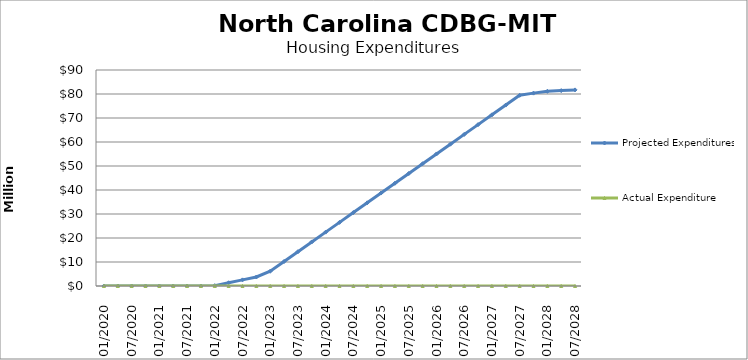
| Category | Projected Expenditures | Actual Expenditure |
|---|---|---|
| 01/2020 | 0 | 0 |
| 04/2020 | 0 | 0 |
| 07/2020 | 0 | 0 |
| 10/2020 | 0 | 0 |
| 01/2021 | 0 | 0 |
| 04/2021 | 0 | 0 |
| 07/2021 | 0 | 0 |
| 10/2021 | 0 | 0 |
| 01/2022 | 150000 | 0 |
| 04/2022 | 1350000 | 0 |
| 07/2022 | 2550000 | 0 |
| 10/2022 | 3750000 | 0 |
| 01/2023 | 6150000 | 0 |
| 04/2023 | 10222864.475 | 0 |
| 07/2023 | 14295728.95 | 0 |
| 10/2023 | 18368593.425 | 0 |
| 01/2024 | 22441457.9 | 0 |
| 04/2024 | 26514322.375 | 0 |
| 07/2024 | 30587186.85 | 0 |
| 10/2024 | 34660051.324 | 0 |
| 01/2025 | 38732915.799 | 0 |
| 04/2025 | 42805780.274 | 0 |
| 07/2025 | 46878644.749 | 0 |
| 10/2025 | 50951509.224 | 0 |
| 01/2026 | 55024373.699 | 0 |
| 04/2026 | 59097238.174 | 0 |
| 07/2026 | 63170102.649 | 0 |
| 10/2026 | 67242967.124 | 0 |
| 01/2027 | 71315831.599 | 0 |
| 04/2027 | 75388696.074 | 0 |
| 07/2027 | 79461560.549 | 0 |
| 10/2027 | 80361560.549 | 0 |
| 01/2028 | 81111560.549 | 0 |
| 04/2028 | 81411560.549 | 0 |
| 07/2028 | 81711560.549 | 0 |